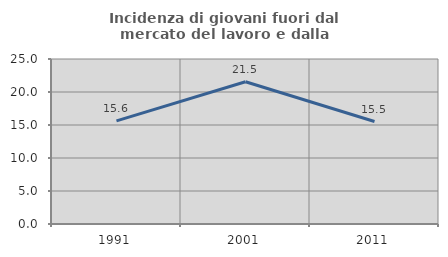
| Category | Incidenza di giovani fuori dal mercato del lavoro e dalla formazione  |
|---|---|
| 1991.0 | 15.63 |
| 2001.0 | 21.549 |
| 2011.0 | 15.526 |